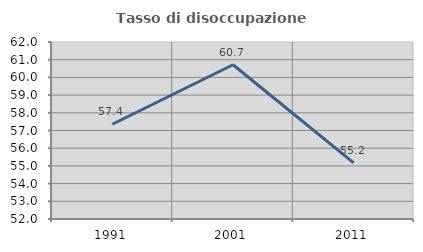
| Category | Tasso di disoccupazione giovanile  |
|---|---|
| 1991.0 | 57.353 |
| 2001.0 | 60.714 |
| 2011.0 | 55.172 |